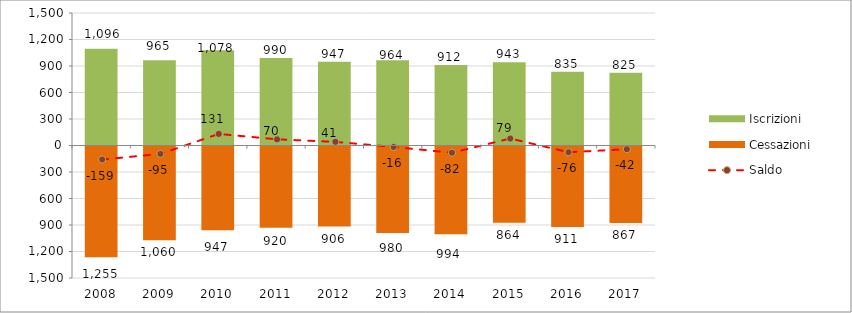
| Category | Iscrizioni | Cessazioni |
|---|---|---|
| 2008.0 | 1096 | -1255 |
| 2009.0 | 965 | -1060 |
| 2010.0 | 1078 | -947 |
| 2011.0 | 990 | -920 |
| 2012.0 | 947 | -906 |
| 2013.0 | 964 | -980 |
| 2014.0 | 912 | -994 |
| 2015.0 | 943 | -864 |
| 2016.0 | 835 | -911 |
| 2017.0 | 825 | -867 |